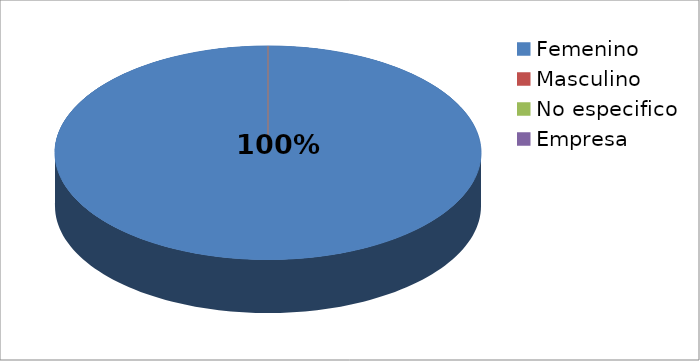
| Category | Series 0 |
|---|---|
| Femenino | 1 |
| Masculino | 0 |
| No especifico | 0 |
| Empresa | 0 |